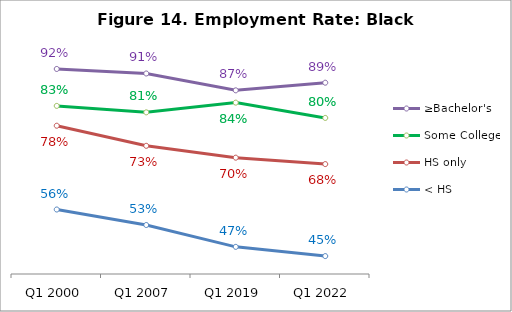
| Category | ≥Bachelor's | Some College | HS only | < HS |
|---|---|---|---|---|
| Q1 2000 | 0.924 | 0.829 | 0.779 | 0.565 |
| Q1 2007 | 0.912 | 0.813 | 0.727 | 0.525 |
| Q1 2019 | 0.869 | 0.838 | 0.697 | 0.469 |
| Q1 2022 | 0.888 | 0.799 | 0.681 | 0.446 |